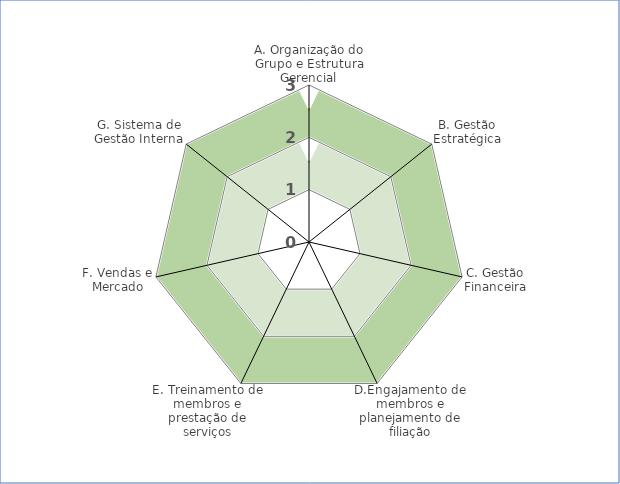
| Category | Series 1 | Series 0 | Series 2 |
|---|---|---|---|
| A. Organização do Grupo e Estrutura Gerencial | 2.5 | 0 | 1.5 |
| B. Gestão Estratégica | 2.5 | 0 | 1.5 |
| C. Gestão Financeira | 2.5 | 0 | 1.5 |
| D.Engajamento de membros e planejamento de filiação | 2.5 | 0 | 1.5 |
| E. Treinamento de membros e prestação de serviços | 2.5 | 0 | 1.5 |
| F. Vendas e Mercado | 2.5 | 0 | 1.5 |
| G. Sistema de Gestão Interna | 2.5 | 0 | 1.5 |